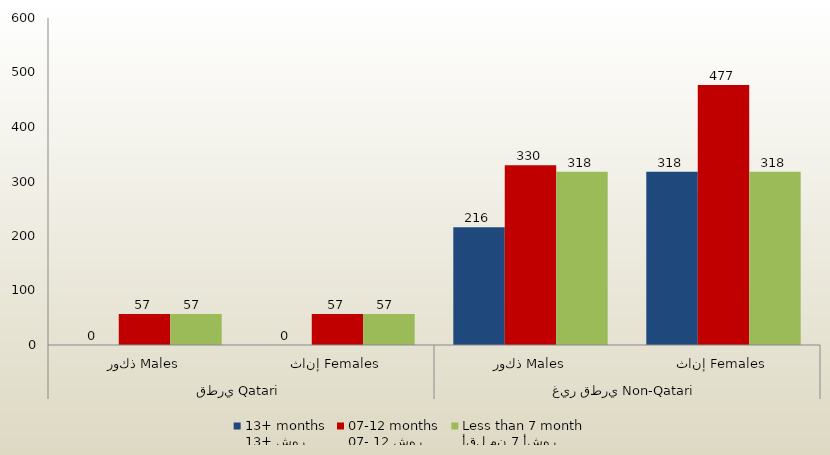
| Category | 13+ شهر
13+ months | 07- 12 شهر
07-12 months | أقل من 7 أشهر
Less than 7 month  |
|---|---|---|---|
| 0 | 0 | 57 | 57 |
| 1 | 0 | 57 | 57 |
| 2 | 216 | 330 | 318 |
| 3 | 318 | 477 | 318 |